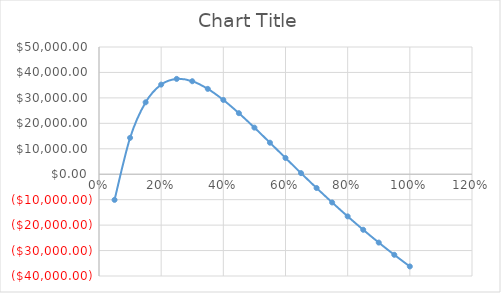
| Category | Series 0 |
|---|---|
| 0.05 | -10081.526 |
| 0.1 | 14299.383 |
| 0.15000000000000002 | 28264.636 |
| 0.2 | 35221.193 |
| 0.25 | 37462.4 |
| 0.3 | 36547.39 |
| 0.35 | 33544.646 |
| 0.39999999999999997 | 29190.813 |
| 0.44999999999999996 | 23995.724 |
| 0.49999999999999994 | 18312.757 |
| 0.5499999999999999 | 12386.519 |
| 0.6 | 6385.498 |
| 0.65 | 424.638 |
| 0.7000000000000001 | -5418.919 |
| 0.7500000000000001 | -11094.782 |
| 0.8000000000000002 | -16571.491 |
| 0.8500000000000002 | -21830.965 |
| 0.9000000000000002 | -26864.528 |
| 0.9500000000000003 | -31670.069 |
| 1.0000000000000002 | -36250 |